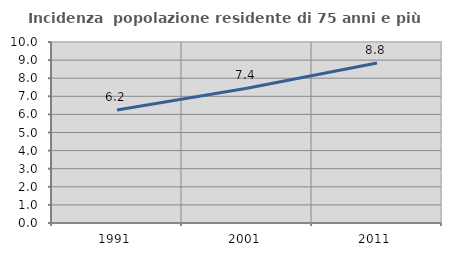
| Category | Incidenza  popolazione residente di 75 anni e più |
|---|---|
| 1991.0 | 6.242 |
| 2001.0 | 7.444 |
| 2011.0 | 8.843 |